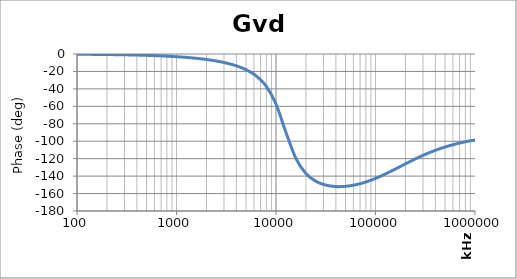
| Category | Gvd Phase |
|---|---|
| 100.0 | -0.307 |
| 125.89254117941677 | -0.387 |
| 158.48931924611153 | -0.487 |
| 199.52623149688802 | -0.613 |
| 251.18864315095806 | -0.772 |
| 316.22776601683825 | -0.972 |
| 398.1071705534976 | -1.225 |
| 501.1872336272727 | -1.543 |
| 630.9573444801932 | -1.944 |
| 794.3282347242821 | -2.451 |
| 1000.0 | -3.092 |
| 1258.925411794168 | -3.907 |
| 1584.8931924611156 | -4.946 |
| 1995.2623149688804 | -6.284 |
| 2511.886431509581 | -8.026 |
| 3162.2776601683804 | -10.339 |
| 3981.071705534977 | -13.503 |
| 5011.872336272732 | -18.035 |
| 6309.573444801938 | -24.971 |
| 7943.282347242815 | -36.566 |
| 10000.0 | -57.363 |
| 12589.254117941671 | -89.841 |
| 15848.931924611146 | -119.763 |
| 19952.623149688792 | -137.035 |
| 25118.86431509586 | -145.912 |
| 31622.77660168384 | -150.292 |
| 39810.71705534974 | -151.968 |
| 50118.723362727294 | -151.733 |
| 63095.73444801934 | -149.962 |
| 79432.82347242824 | -146.871 |
| 100000.0 | -142.649 |
| 125892.54117941685 | -137.537 |
| 158489.31924611164 | -131.858 |
| 199526.23149688813 | -125.992 |
| 251188.64315095844 | -120.306 |
| 316227.7660168382 | -115.087 |
| 398107.17055349716 | -110.497 |
| 501187.23362727347 | -106.59 |
| 630957.3444801942 | -103.341 |
| 794328.2347242833 | -100.682 |
| 1000000.0 | -98.528 |